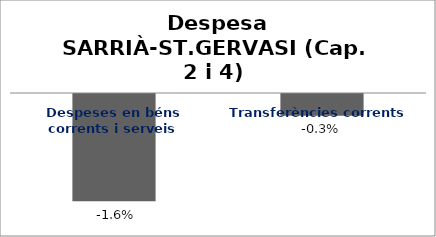
| Category | Series 0 |
|---|---|
| Despeses en béns corrents i serveis | -0.016 |
| Transferències corrents | -0.003 |